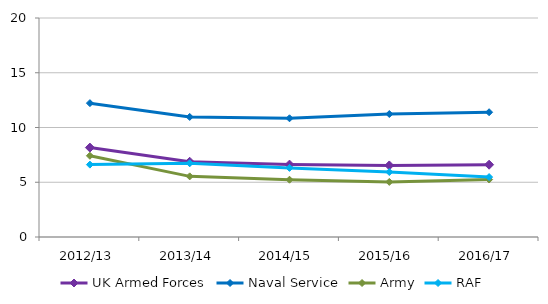
| Category | UK Armed Forces | Naval Service | Army | RAF |
|---|---|---|---|---|
| 2012/13 | 8.166 | 12.224 | 7.418 | 6.61 |
| 2013/14 | 6.872 | 10.964 | 5.537 | 6.733 |
| 2014/15 | 6.612 | 10.843 | 5.231 | 6.309 |
| 2015/16 | 6.534 | 11.229 | 5.03 | 5.931 |
| 2016/17 | 6.603 | 11.395 | 5.249 | 5.473 |